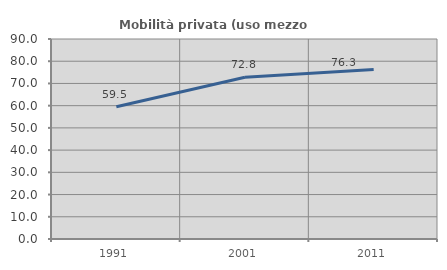
| Category | Mobilità privata (uso mezzo privato) |
|---|---|
| 1991.0 | 59.535 |
| 2001.0 | 72.803 |
| 2011.0 | 76.268 |